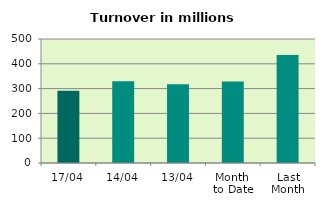
| Category | Series 0 |
|---|---|
| 17/04 | 291.501 |
| 14/04 | 329.869 |
| 13/04 | 317.415 |
| Month 
to Date | 328.772 |
| Last
Month | 435.216 |